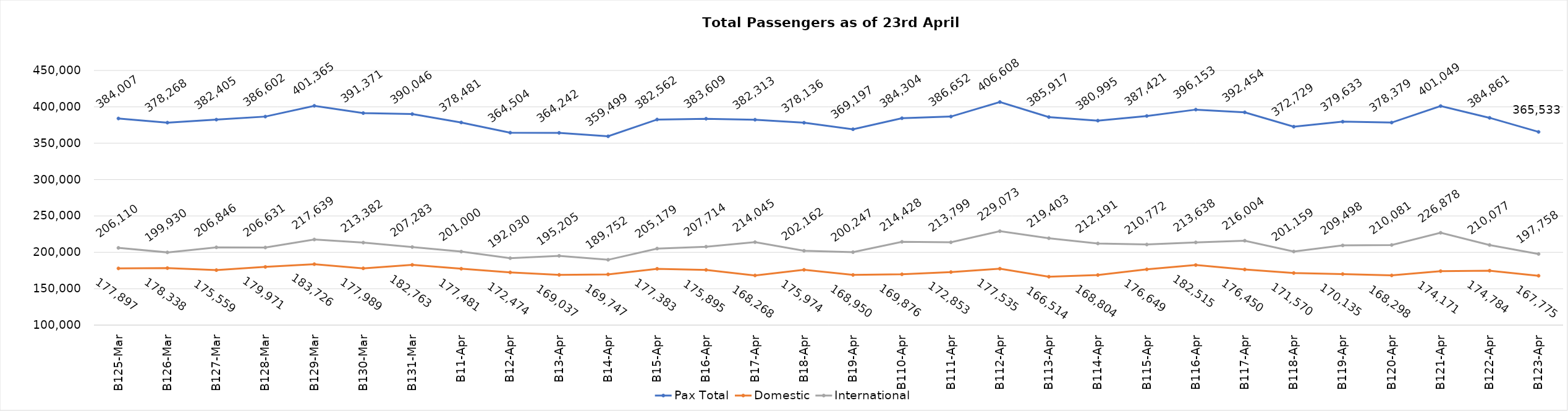
| Category | Pax Total | Domestic | International |
|---|---|---|---|
| 2024-03-25 | 384007 | 177897 | 206110 |
| 2024-03-26 | 378268 | 178338 | 199930 |
| 2024-03-27 | 382405 | 175559 | 206846 |
| 2024-03-28 | 386602 | 179971 | 206631 |
| 2024-03-29 | 401365 | 183726 | 217639 |
| 2024-03-30 | 391371 | 177989 | 213382 |
| 2024-03-31 | 390046 | 182763 | 207283 |
| 2024-04-01 | 378481 | 177481 | 201000 |
| 2024-04-02 | 364504 | 172474 | 192030 |
| 2024-04-03 | 364242 | 169037 | 195205 |
| 2024-04-04 | 359499 | 169747 | 189752 |
| 2024-04-05 | 382562 | 177383 | 205179 |
| 2024-04-06 | 383609 | 175895 | 207714 |
| 2024-04-07 | 382313 | 168268 | 214045 |
| 2024-04-08 | 378136 | 175974 | 202162 |
| 2024-04-09 | 369197 | 168950 | 200247 |
| 2024-04-10 | 384304 | 169876 | 214428 |
| 2024-04-11 | 386652 | 172853 | 213799 |
| 2024-04-12 | 406608 | 177535 | 229073 |
| 2024-04-13 | 385917 | 166514 | 219403 |
| 2024-04-14 | 380995 | 168804 | 212191 |
| 2024-04-15 | 387421 | 176649 | 210772 |
| 2024-04-16 | 396153 | 182515 | 213638 |
| 2024-04-17 | 392454 | 176450 | 216004 |
| 2024-04-18 | 372729 | 171570 | 201159 |
| 2024-04-19 | 379633 | 170135 | 209498 |
| 2024-04-20 | 378379 | 168298 | 210081 |
| 2024-04-21 | 401049 | 174171 | 226878 |
| 2024-04-22 | 384861 | 174784 | 210077 |
| 2024-04-23 | 365533 | 167775 | 197758 |